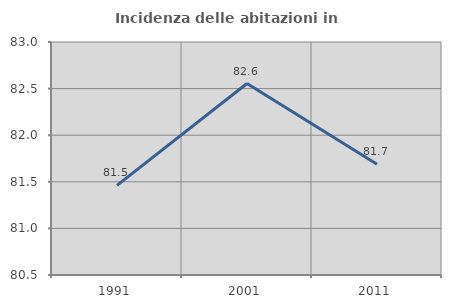
| Category | Incidenza delle abitazioni in proprietà  |
|---|---|
| 1991.0 | 81.462 |
| 2001.0 | 82.554 |
| 2011.0 | 81.689 |